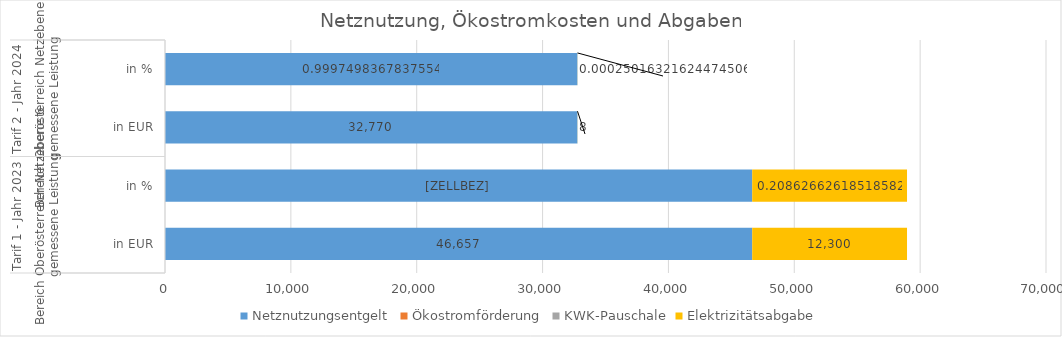
| Category | Netznutzungsentgelt | Ökostromförderung | KWK-Pauschale | Elektrizitätsabgabe |
|---|---|---|---|---|
| 0 | 46657 | 0 | 0 | 12300 |
| 1 | 46657 | 0 | 0 | 12300 |
| 2 | 32770.4 | 0 | 0 | 8.2 |
| 3 | 32770.4 | 0 | 0 | 8.2 |